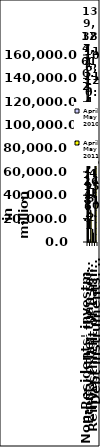
| Category | April- May 2010 | April-May 2011 |
|---|---|---|
| Non-Residents' investments 
in the Phils. | 124610.231 | 139387.744 |
| Equity other than reinvestment of earnings | 2264.56 | 25455.349 |
| Reinvestment of earnings | 11130.226 | 7812.089 |
| Debt instruments, net | 111215.445 | 106120.306 |